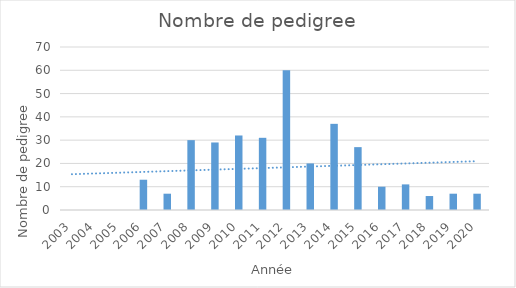
| Category | Series 0 |
|---|---|
| 2003.0 | 0 |
| 2004.0 | 0 |
| 2005.0 | 0 |
| 2006.0 | 13 |
| 2007.0 | 7 |
| 2008.0 | 30 |
| 2009.0 | 29 |
| 2010.0 | 32 |
| 2011.0 | 31 |
| 2012.0 | 60 |
| 2013.0 | 20 |
| 2014.0 | 37 |
| 2015.0 | 27 |
| 2016.0 | 10 |
| 2017.0 | 11 |
| 2018.0 | 6 |
| 2019.0 | 7 |
| 2020.0 | 7 |